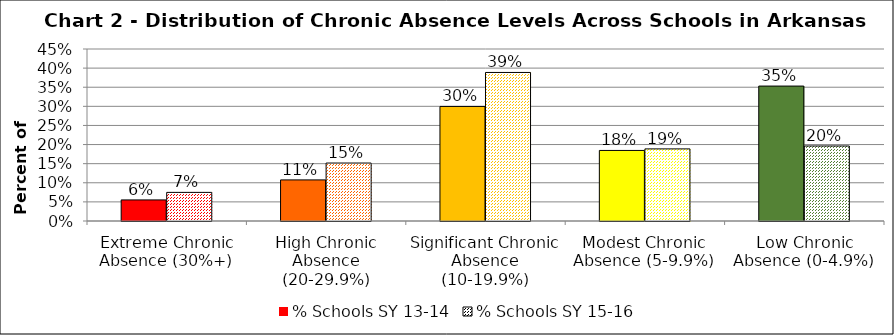
| Category | % Schools SY 13-14 | % Schools SY 15-16 |
|---|---|---|
| Extreme Chronic Absence (30%+) | 0.055 | 0.075 |
| High Chronic Absence (20-29.9%) | 0.108 | 0.152 |
| Significant Chronic Absence (10-19.9%) | 0.3 | 0.389 |
| Modest Chronic Absence (5-9.9%) | 0.185 | 0.189 |
| Low Chronic Absence (0-4.9%) | 0.353 | 0.196 |